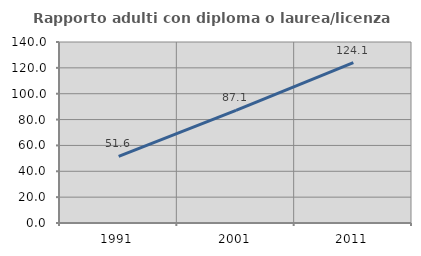
| Category | Rapporto adulti con diploma o laurea/licenza media  |
|---|---|
| 1991.0 | 51.556 |
| 2001.0 | 87.13 |
| 2011.0 | 124.069 |